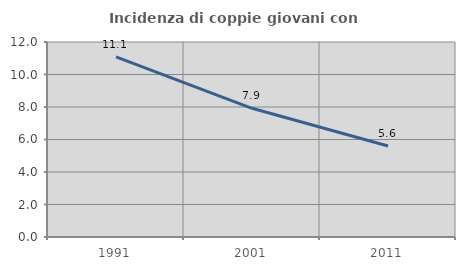
| Category | Incidenza di coppie giovani con figli |
|---|---|
| 1991.0 | 11.087 |
| 2001.0 | 7.921 |
| 2011.0 | 5.603 |